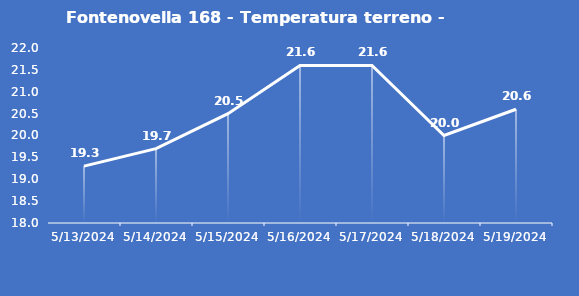
| Category | Fontenovella 168 - Temperatura terreno - Grezzo (°C) |
|---|---|
| 5/13/24 | 19.3 |
| 5/14/24 | 19.7 |
| 5/15/24 | 20.5 |
| 5/16/24 | 21.6 |
| 5/17/24 | 21.6 |
| 5/18/24 | 20 |
| 5/19/24 | 20.6 |